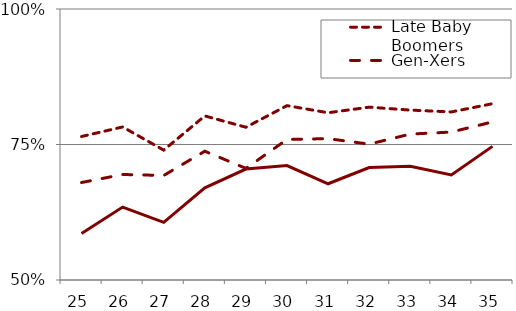
| Category | Late Baby Boomers | Gen-Xers | Millennials |
|---|---|---|---|
| 25.0 | 0.765 | 0.68 | 0.586 |
| 26.0 | 0.782 | 0.695 | 0.635 |
| 27.0 | 0.74 | 0.693 | 0.606 |
| 28.0 | 0.803 | 0.738 | 0.67 |
| 29.0 | 0.782 | 0.706 | 0.705 |
| 30.0 | 0.822 | 0.759 | 0.711 |
| 31.0 | 0.809 | 0.761 | 0.678 |
| 32.0 | 0.819 | 0.751 | 0.707 |
| 33.0 | 0.813 | 0.769 | 0.71 |
| 34.0 | 0.81 | 0.773 | 0.694 |
| 35.0 | 0.825 | 0.792 | 0.747 |